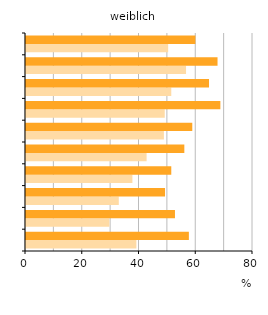
| Category | 2014¹ | 2019 |
|---|---|---|
| 0 | 38.9 | 57.4 |
| 1 | 29.4 | 52.5 |
| 2 | 32.7 | 49 |
| 3 | 37.5 | 51.2 |
| 4 | 42.5 | 55.8 |
| 5 | 48.6 | 58.6 |
| 6 | 48.9 | 68.5 |
| 7 | 51.2 | 64.5 |
| 8 | 56.4 | 67.5 |
| 9 | 50.1 | 59.7 |